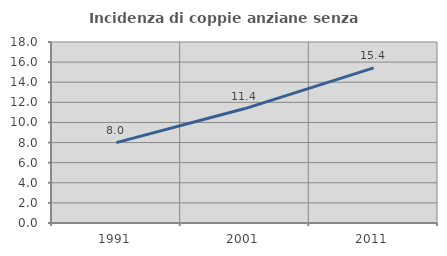
| Category | Incidenza di coppie anziane senza figli  |
|---|---|
| 1991.0 | 7.994 |
| 2001.0 | 11.38 |
| 2011.0 | 15.424 |